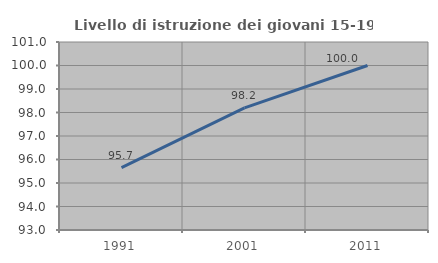
| Category | Livello di istruzione dei giovani 15-19 anni |
|---|---|
| 1991.0 | 95.652 |
| 2001.0 | 98.198 |
| 2011.0 | 100 |